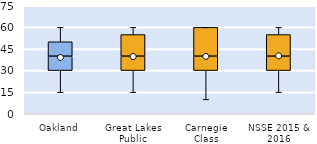
| Category | 25th | 50th | 75th |
|---|---|---|---|
| Oakland | 30 | 10 | 10 |
| Great Lakes Public | 30 | 10 | 15 |
| Carnegie Class | 30 | 10 | 20 |
| NSSE 2015 & 2016 | 30 | 10 | 15 |